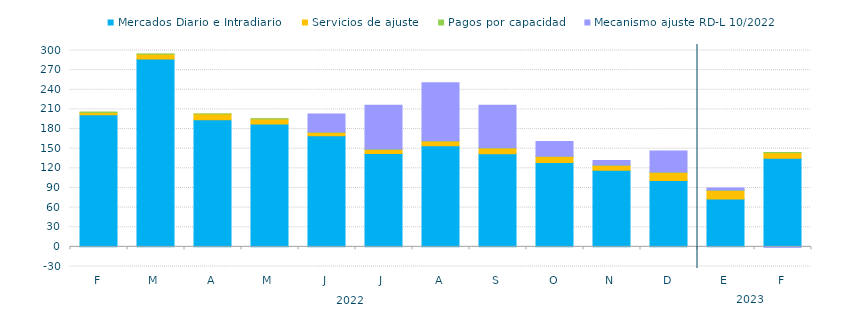
| Category | Mercados Diario e Intradiario  | Servicios de ajuste | Pagos por capacidad | Mecanismo ajuste RD-L 10/2022 |
|---|---|---|---|---|
| F | 201.93 | 3.5 | 0.47 | 0 |
| M | 287.12 | 7.08 | 0.33 | 0 |
| A | 194.2 | 8.61 | 0.24 | 0 |
| M | 187.7 | 7.81 | 0.23 | 0 |
| J | 169.63 | 5.43 | 0.26 | 27.52 |
| J | 142.79 | 6.29 | 0.44 | 66.93 |
| A | 154.49 | 7.2 | 0.26 | 88.84 |
| S | 142.09 | 9.09 | 0.26 | 64.99 |
| O | 128.7 | 9.63 | 0.21 | 22.46 |
| N | 117.15 | 7.53 | 0.31 | 7.14 |
| D | 101.28 | 12.79 | 0.42 | 32.09 |
| E | 73.08 | 13.53 | 0.33 | 2.92 |
| F | 135.51 | 8.45 | 0.35 | -0.71 |